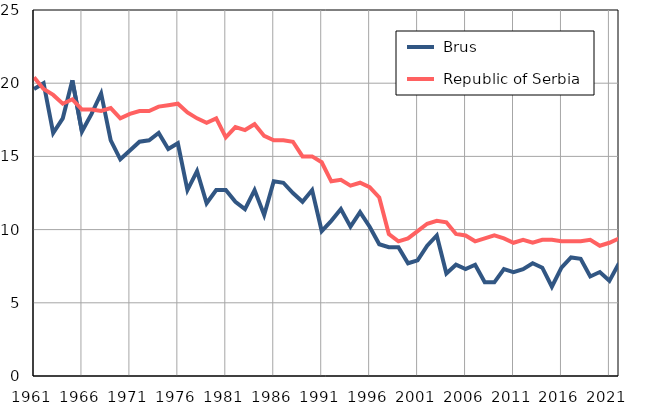
| Category |  Brus |  Republic of Serbia |
|---|---|---|
| 1961.0 | 19.6 | 20.4 |
| 1962.0 | 20 | 19.6 |
| 1963.0 | 16.6 | 19.2 |
| 1964.0 | 17.6 | 18.6 |
| 1965.0 | 20.2 | 18.9 |
| 1966.0 | 16.7 | 18.2 |
| 1967.0 | 17.9 | 18.2 |
| 1968.0 | 19.3 | 18.1 |
| 1969.0 | 16.1 | 18.3 |
| 1970.0 | 14.8 | 17.6 |
| 1971.0 | 15.4 | 17.9 |
| 1972.0 | 16 | 18.1 |
| 1973.0 | 16.1 | 18.1 |
| 1974.0 | 16.6 | 18.4 |
| 1975.0 | 15.5 | 18.5 |
| 1976.0 | 15.9 | 18.6 |
| 1977.0 | 12.7 | 18 |
| 1978.0 | 14 | 17.6 |
| 1979.0 | 11.8 | 17.3 |
| 1980.0 | 12.7 | 17.6 |
| 1981.0 | 12.7 | 16.3 |
| 1982.0 | 11.9 | 17 |
| 1983.0 | 11.4 | 16.8 |
| 1984.0 | 12.7 | 17.2 |
| 1985.0 | 11 | 16.4 |
| 1986.0 | 13.3 | 16.1 |
| 1987.0 | 13.2 | 16.1 |
| 1988.0 | 12.5 | 16 |
| 1989.0 | 11.9 | 15 |
| 1990.0 | 12.7 | 15 |
| 1991.0 | 9.9 | 14.6 |
| 1992.0 | 10.6 | 13.3 |
| 1993.0 | 11.4 | 13.4 |
| 1994.0 | 10.2 | 13 |
| 1995.0 | 11.2 | 13.2 |
| 1996.0 | 10.2 | 12.9 |
| 1997.0 | 9 | 12.2 |
| 1998.0 | 8.8 | 9.7 |
| 1999.0 | 8.8 | 9.2 |
| 2000.0 | 7.7 | 9.4 |
| 2001.0 | 7.9 | 9.9 |
| 2002.0 | 8.9 | 10.4 |
| 2003.0 | 9.6 | 10.6 |
| 2004.0 | 7 | 10.5 |
| 2005.0 | 7.6 | 9.7 |
| 2006.0 | 7.3 | 9.6 |
| 2007.0 | 7.6 | 9.2 |
| 2008.0 | 6.4 | 9.4 |
| 2009.0 | 6.4 | 9.6 |
| 2010.0 | 7.3 | 9.4 |
| 2011.0 | 7.1 | 9.1 |
| 2012.0 | 7.3 | 9.3 |
| 2013.0 | 7.7 | 9.1 |
| 2014.0 | 7.4 | 9.3 |
| 2015.0 | 6.1 | 9.3 |
| 2016.0 | 7.4 | 9.2 |
| 2017.0 | 8.1 | 9.2 |
| 2018.0 | 8 | 9.2 |
| 2019.0 | 6.8 | 9.3 |
| 2020.0 | 7.1 | 8.9 |
| 2021.0 | 6.5 | 9.1 |
| 2022.0 | 7.7 | 9.4 |